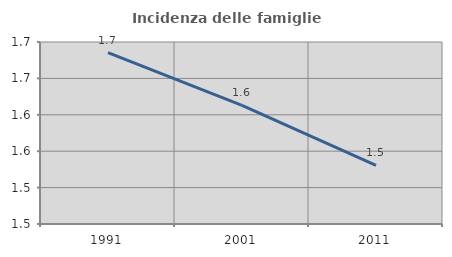
| Category | Incidenza delle famiglie numerose |
|---|---|
| 1991.0 | 1.685 |
| 2001.0 | 1.613 |
| 2011.0 | 1.531 |